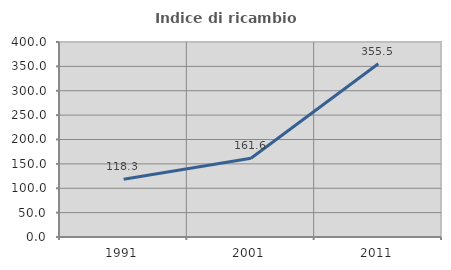
| Category | Indice di ricambio occupazionale  |
|---|---|
| 1991.0 | 118.331 |
| 2001.0 | 161.563 |
| 2011.0 | 355.458 |